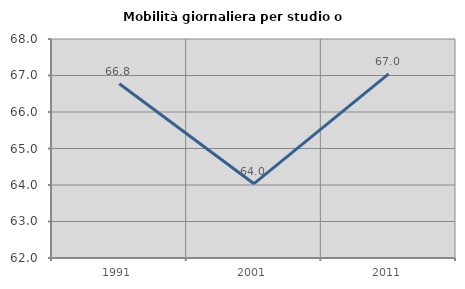
| Category | Mobilità giornaliera per studio o lavoro |
|---|---|
| 1991.0 | 66.772 |
| 2001.0 | 64.036 |
| 2011.0 | 67.045 |